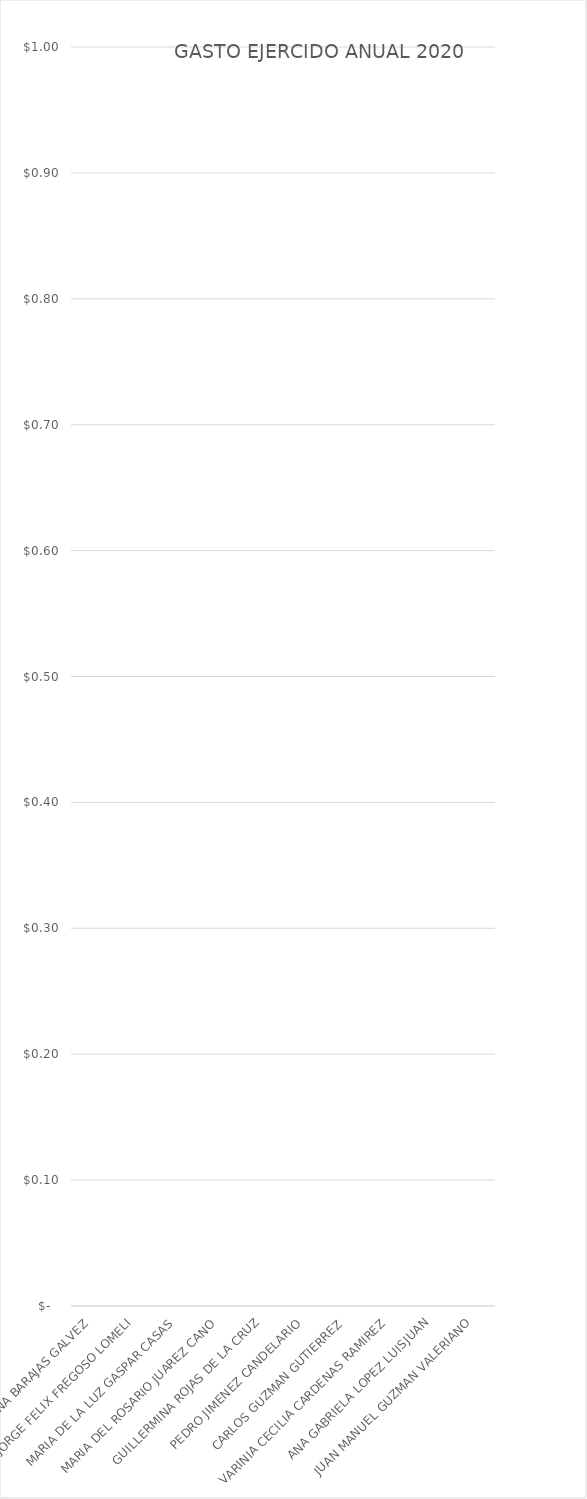
| Category | GASTO EJERCIDO ANUAL 2020 |
|---|---|
| ARIANA BARAJAS GALVEZ | 0 |
| JORGE FELIX FREGOSO LOMELI | 0 |
| MARIA DE LA LUZ GASPAR CASAS | 0 |
| MARIA DEL ROSARIO JUAREZ CANO | 0 |
| GUILLERMINA ROJAS DE LA CRUZ | 0 |
| PEDRO JIMENEZ CANDELARIO | 0 |
| CARLOS GUZMAN GUTIERREZ | 0 |
| VARINIA CECILIA CARDENAS RAMIREZ | 0 |
| ANA GABRIELA LOPEZ LUISJUAN | 0 |
| JUAN MANUEL GUZMAN VALERIANO | 0 |